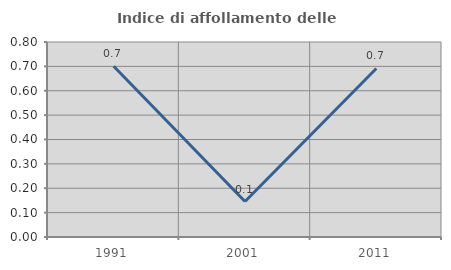
| Category | Indice di affollamento delle abitazioni  |
|---|---|
| 1991.0 | 0.701 |
| 2001.0 | 0.146 |
| 2011.0 | 0.692 |